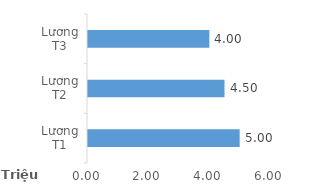
| Category | Total |
|---|---|
| Lương T1 | 5000000 |
| Lương T2 | 4500000 |
| Lương T3 | 4000000 |